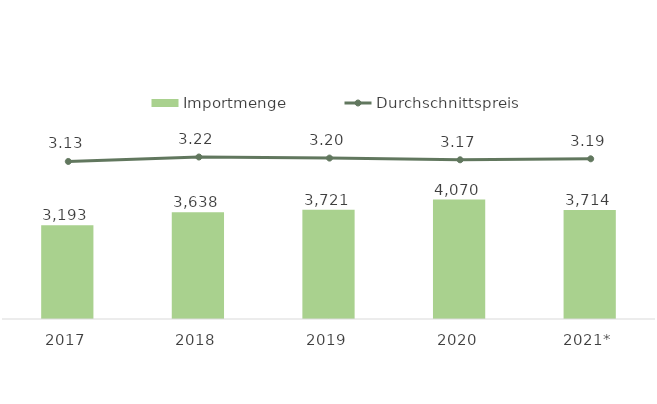
| Category | Importmenge |
|---|---|
| 2017 | 3193.065 |
| 2018 | 3638.43 |
| 2019 | 3720.575 |
| 2020 | 4069.614 |
| 2021* | 3713.831 |